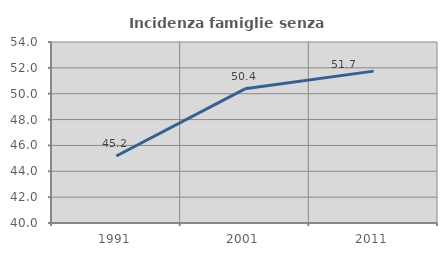
| Category | Incidenza famiglie senza nuclei |
|---|---|
| 1991.0 | 45.185 |
| 2001.0 | 50.376 |
| 2011.0 | 51.748 |